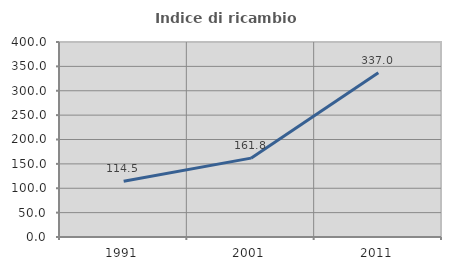
| Category | Indice di ricambio occupazionale  |
|---|---|
| 1991.0 | 114.516 |
| 2001.0 | 161.765 |
| 2011.0 | 337.037 |